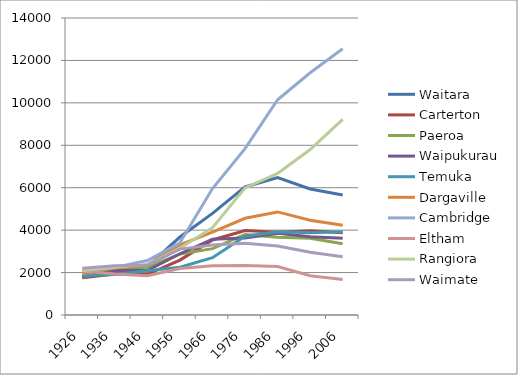
| Category | Waitara | Carterton | Paeroa | Waipukurau | Temuka | Dargaville | Cambridge | Eltham | Rangiora | Waimate |
|---|---|---|---|---|---|---|---|---|---|---|
| 1926.0 | 1750.014 | 1758.076 | 1763.459 | 1798.094 | 1851.551 | 1958.459 | 2056.52 | 2079.608 | 2092.653 | 2206.04 |
| 1936.0 | 2011.24 | 1935.395 | 2186.77 | 2111.165 | 1913.637 | 2217.278 | 2241.719 | 1937.77 | 2246.14 | 2318.194 |
| 1946.0 | 2295 | 1918 | 2253 | 2095 | 2081 | 2370 | 2567 | 1855 | 2385 | 2351 |
| 1956.0 | 3675 | 2590 | 2871 | 2886 | 2254 | 3306 | 3408 | 2192 | 3150 | 3107 |
| 1966.0 | 4790 | 3536 | 3129 | 3569 | 2703 | 3902 | 5962 | 2319 | 4117 | 3300 |
| 1976.0 | 6036 | 3985 | 3796 | 3632 | 3711 | 4559 | 7841 | 2334 | 5991 | 3378 |
| 1986.0 | 6482 | 3902 | 3661 | 3855 | 3919 | 4859 | 10145 | 2288 | 6674 | 3250 |
| 1996.0 | 5940.594 | 3967.501 | 3620.706 | 3687 | 3878.758 | 4469.636 | 11417.6 | 1850.933 | 7797.544 | 2961.254 |
| 2006.0 | 5652.042 | 3877.047 | 3355.917 | 3618 | 3919 | 4228.295 | 12546.992 | 1677.867 | 9217.544 | 2749.506 |